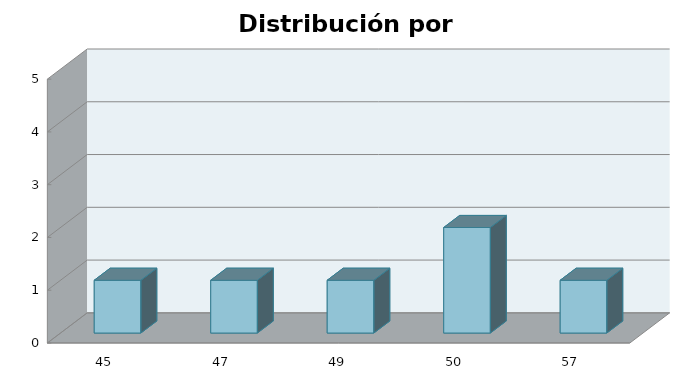
| Category | Series 1 |
|---|---|
| 45.0 | 1 |
| 47.0 | 1 |
| 49.0 | 1 |
| 50.0 | 2 |
| 57.0 | 1 |